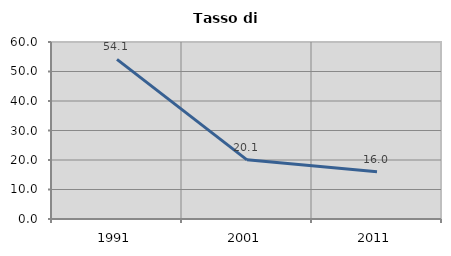
| Category | Tasso di disoccupazione   |
|---|---|
| 1991.0 | 54.113 |
| 2001.0 | 20.064 |
| 2011.0 | 16.018 |